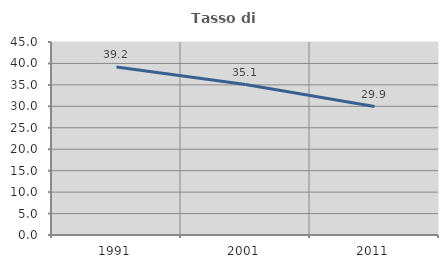
| Category | Tasso di occupazione   |
|---|---|
| 1991.0 | 39.194 |
| 2001.0 | 35.088 |
| 2011.0 | 29.944 |